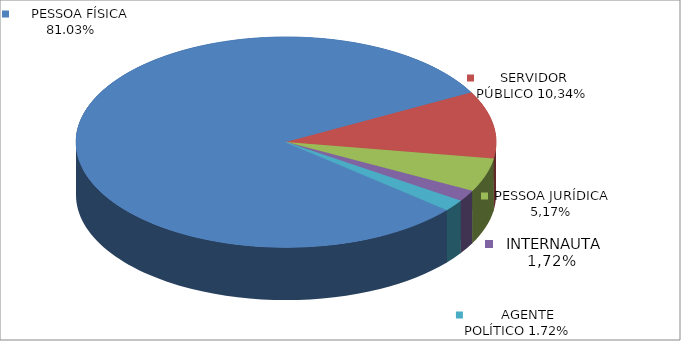
| Category | Series 0 |
|---|---|
|      PESSOA FÍSICA | 0.81 |
|      SERVIDOR PÚBLICO | 0.103 |
|      PESSOA JURÍDICA | 0.052 |
|      INTERNAUTA | 0.017 |
|      AGENTE POLÍTICO | 0.017 |